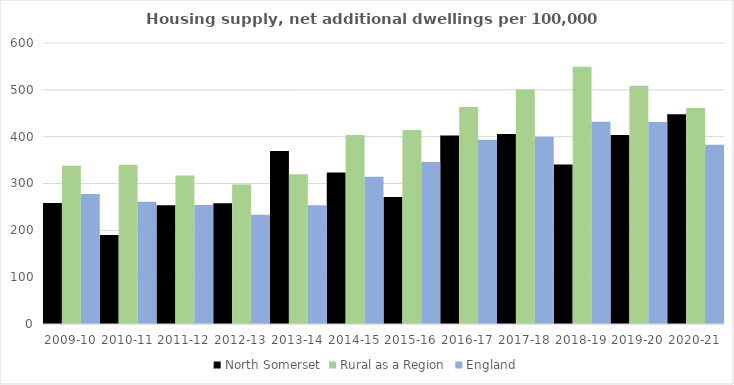
| Category | North Somerset | Rural as a Region | England |
|---|---|---|---|
| 2009-10 | 258.29 | 337.852 | 277.548 |
| 2010-11 | 190.179 | 340.105 | 260.994 |
| 2011-12 | 253.581 | 317.04 | 254.007 |
| 2012-13 | 257.76 | 297.763 | 233.153 |
| 2013-14 | 369.576 | 319.835 | 253.602 |
| 2014-15 | 323.751 | 403.796 | 314.256 |
| 2015-16 | 271.029 | 414.091 | 346.154 |
| 2016-17 | 402.367 | 463.209 | 393.256 |
| 2017-18 | 405.48 | 500.68 | 399.646 |
| 2018-19 | 340.783 | 549.491 | 432.099 |
| 2019-20 | 403.623 | 508.493 | 431.187 |
| 2020-21 | 448.106 | 461.114 | 382.827 |